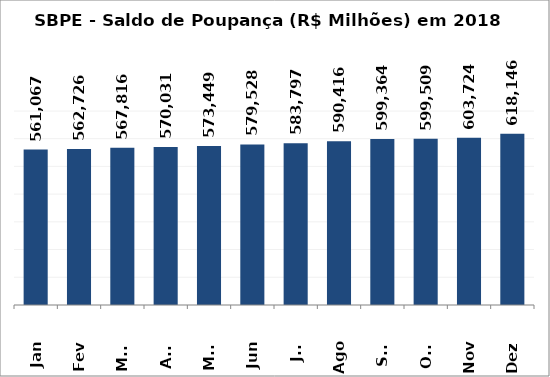
| Category | SBPE - Saldo de Poupança (R$ Milhões) em 2018 |
|---|---|
| Jan | 561067.029 |
| Fev | 562726.35 |
| Mar | 567815.814 |
| Abr | 570031.124 |
| Mai | 573448.941 |
| Jun | 579528.234 |
| Jul | 583797.2 |
| Ago | 590415.66 |
| Set | 599363.904 |
| Out | 599508.867 |
| Nov | 603724.29 |
| Dez | 618146.063 |